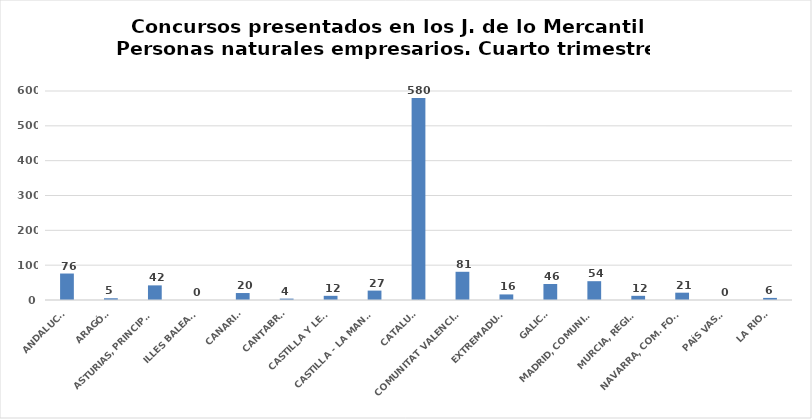
| Category | Series 0 |
|---|---|
| ANDALUCÍA | 76 |
| ARAGÓN | 5 |
| ASTURIAS, PRINCIPADO | 42 |
| ILLES BALEARS | 0 |
| CANARIAS | 20 |
| CANTABRIA | 4 |
| CASTILLA Y LEÓN | 12 |
| CASTILLA - LA MANCHA | 27 |
| CATALUÑA | 580 |
| COMUNITAT VALENCIANA | 81 |
| EXTREMADURA | 16 |
| GALICIA | 46 |
| MADRID, COMUNIDAD | 54 |
| MURCIA, REGIÓN | 12 |
| NAVARRA, COM. FORAL | 21 |
| PAÍS VASCO | 0 |
| LA RIOJA | 6 |